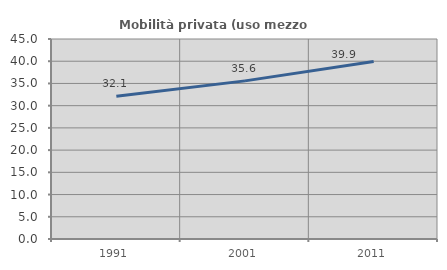
| Category | Mobilità privata (uso mezzo privato) |
|---|---|
| 1991.0 | 32.129 |
| 2001.0 | 35.58 |
| 2011.0 | 39.917 |